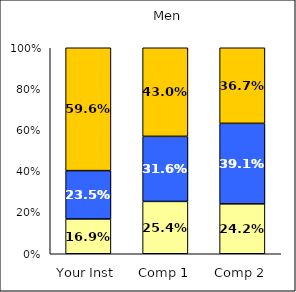
| Category | Low Academic Self-Concept | Average Academic Self-Concept | High Academic Self-Concept |
|---|---|---|---|
| Your Inst | 0.169 | 0.235 | 0.596 |
| Comp 1 | 0.254 | 0.316 | 0.43 |
| Comp 2 | 0.242 | 0.391 | 0.367 |